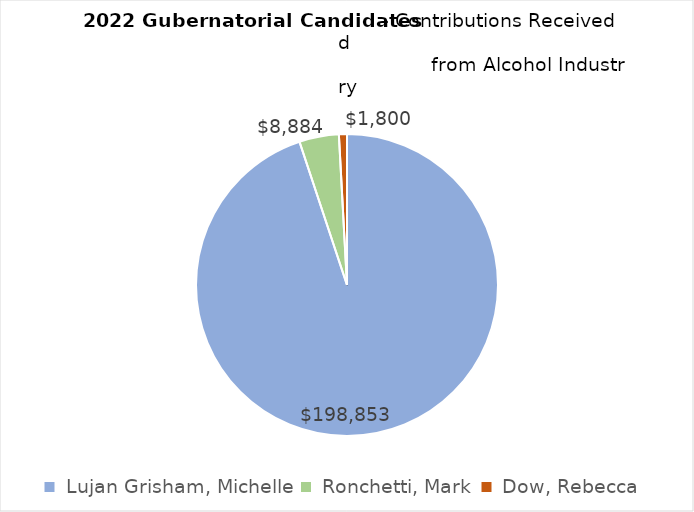
| Category |  Contributions Received  |
|---|---|
|  Lujan Grisham, Michelle  | 198853 |
|  Ronchetti, Mark  | 8883.79 |
|  Dow, Rebecca  | 1800 |